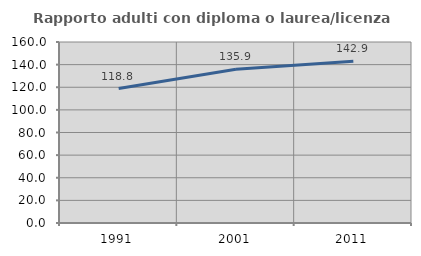
| Category | Rapporto adulti con diploma o laurea/licenza media  |
|---|---|
| 1991.0 | 118.845 |
| 2001.0 | 135.91 |
| 2011.0 | 142.933 |